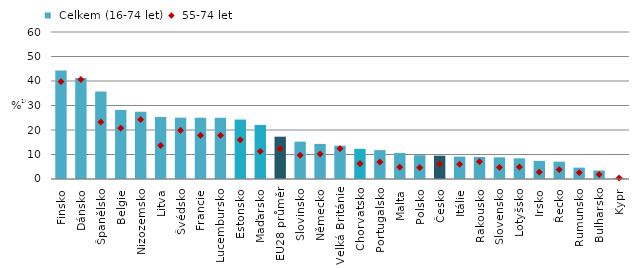
| Category |  Celkem (16-74 let) |
|---|---|
| Finsko | 44.257 |
| Dánsko | 41.236 |
| Španělsko | 35.717 |
| Belgie | 28.2 |
| Nizozemsko | 27.412 |
| Litva | 25.313 |
| Švédsko | 25.038 |
| Francie | 25.025 |
| Lucembursko | 24.988 |
| Estonsko | 24.251 |
| Maďarsko | 22.045 |
| EU28 průměr | 17.262 |
| Slovinsko | 15.259 |
| Německo | 14.333 |
| Velká Británie | 13.575 |
| Chorvatsko | 12.301 |
| Portugalsko | 11.797 |
| Malta | 10.651 |
| Polsko | 9.721 |
| Česko | 9.515 |
| Itálie | 9.144 |
| Rakousko | 9.004 |
| Slovensko | 8.846 |
| Lotyšsko | 8.443 |
| Irsko | 7.407 |
| Řecko | 7.074 |
| Rumunsko | 4.65 |
| Bulharsko | 3.459 |
| Kypr | 0.519 |